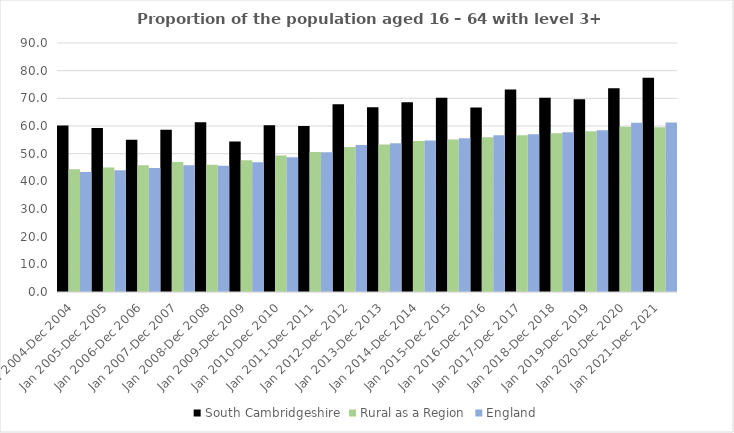
| Category | South Cambridgeshire | Rural as a Region | England |
|---|---|---|---|
| Jan 2004-Dec 2004 | 60.2 | 44.405 | 43.4 |
| Jan 2005-Dec 2005 | 59.3 | 44.973 | 44 |
| Jan 2006-Dec 2006 | 55 | 45.774 | 44.8 |
| Jan 2007-Dec 2007 | 58.6 | 46.968 | 45.8 |
| Jan 2008-Dec 2008 | 61.4 | 45.964 | 45.6 |
| Jan 2009-Dec 2009 | 54.4 | 47.59 | 46.9 |
| Jan 2010-Dec 2010 | 60.3 | 49.362 | 48.7 |
| Jan 2011-Dec 2011 | 60 | 50.602 | 50.5 |
| Jan 2012-Dec 2012 | 67.9 | 52.439 | 53.1 |
| Jan 2013-Dec 2013 | 66.8 | 53.276 | 53.8 |
| Jan 2014-Dec 2014 | 68.6 | 54.57 | 54.8 |
| Jan 2015-Dec 2015 | 70.2 | 55.16 | 55.6 |
| Jan 2016-Dec 2016 | 66.7 | 55.941 | 56.7 |
| Jan 2017-Dec 2017 | 73.2 | 56.689 | 57 |
| Jan 2018-Dec 2018 | 70.2 | 57.389 | 57.7 |
| Jan 2019-Dec 2019 | 69.7 | 58.147 | 58.5 |
| Jan 2020-Dec 2020 | 73.6 | 59.771 | 61.2 |
| Jan 2021-Dec 2021 | 77.4 | 59.54 | 61.3 |